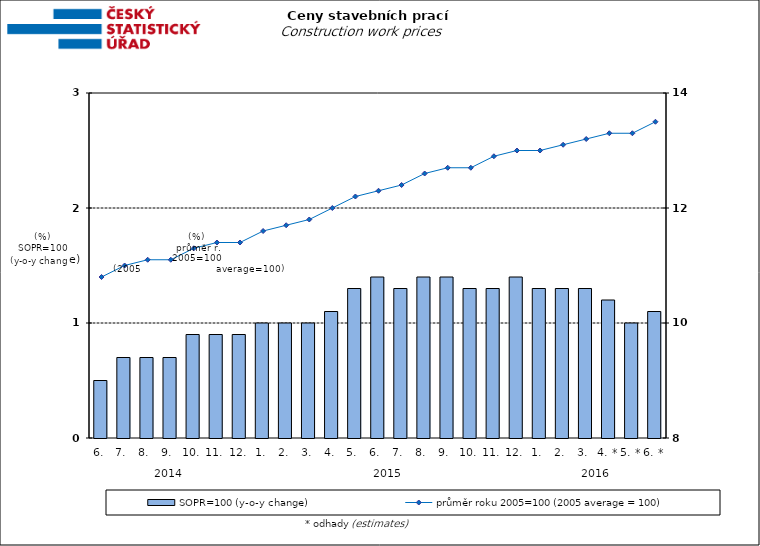
| Category | SOPR=100 (y-o-y change)   |
|---|---|
| 0 | 0.5 |
| 1 | 0.7 |
| 2 | 0.7 |
| 3 | 0.7 |
| 4 | 0.9 |
| 5 | 0.9 |
| 6 | 0.9 |
| 7 | 1 |
| 8 | 1 |
| 9 | 1 |
| 10 | 1.1 |
| 11 | 1.3 |
| 12 | 1.4 |
| 13 | 1.3 |
| 14 | 1.4 |
| 15 | 1.4 |
| 16 | 1.3 |
| 17 | 1.3 |
| 18 | 1.4 |
| 19 | 1.3 |
| 20 | 1.3 |
| 21 | 1.3 |
| 22 | 1.2 |
| 23 | 1 |
| 24 | 1.1 |